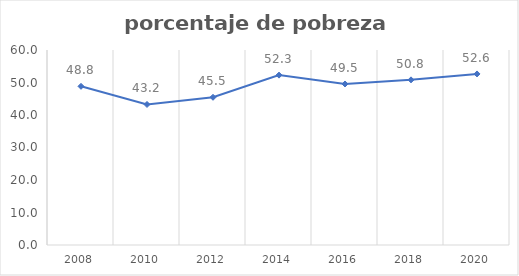
| Category | Series 0 |
|---|---|
| 2008.0 | 48.826 |
| 2010.0 | 43.242 |
| 2012.0 | 45.452 |
| 2014.0 | 52.272 |
| 2016.0 | 49.545 |
| 2018.0 | 50.816 |
| 2020.0 | 52.633 |